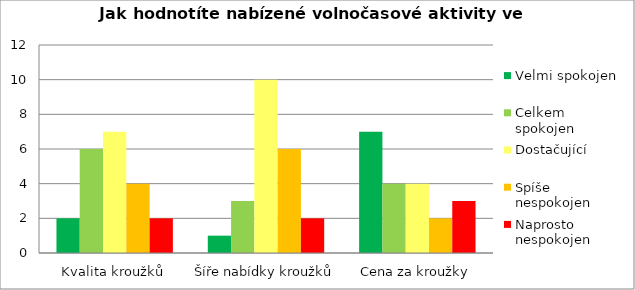
| Category | Velmi spokojen | Celkem 
spokojen | Dostačující | Spíše 
nespokojen | Naprosto 
nespokojen |
|---|---|---|---|---|---|
| Kvalita kroužků | 2 | 6 | 7 | 4 | 2 |
| Šíře nabídky kroužků | 1 | 3 | 10 | 6 | 2 |
| Cena za kroužky | 7 | 4 | 4 | 2 | 3 |